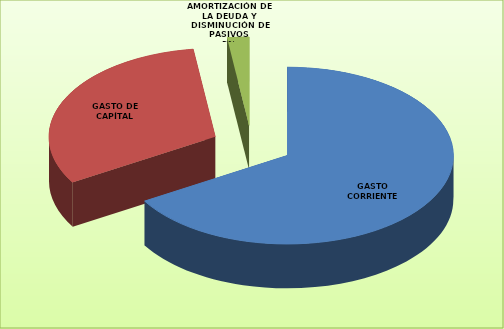
| Category | Series 0 |
|---|---|
| GASTO CORRIENTE | 53933705 |
| GASTO DE CAPÍTAL | 25588057 |
| AMORTIZACIÓN DE LA DEUDA Y DISMINUCIÓN DE PASIVOS | 1721339 |